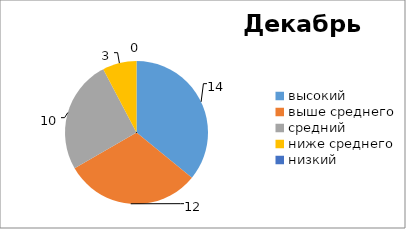
| Category | Series 0 |
|---|---|
| высокий | 14 |
| выше среднего | 12 |
| средний | 10 |
| ниже среднего | 3 |
| низкий | 0 |